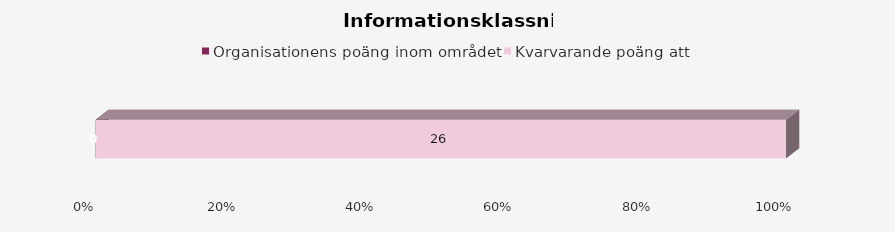
| Category | Organisationens poäng inom området | Kvarvarande poäng att samla |
|---|---|---|
| 0 | 0 | 26 |